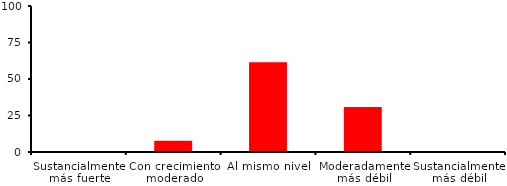
| Category | Series 0 |
|---|---|
| Sustancialmente más fuerte | 0 |
| Con crecimiento moderado | 7.692 |
| Al mismo nivel | 61.538 |
| Moderadamente más débil | 30.769 |
| Sustancialmente más débil | 0 |